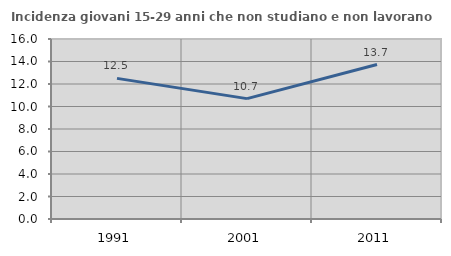
| Category | Incidenza giovani 15-29 anni che non studiano e non lavorano  |
|---|---|
| 1991.0 | 12.5 |
| 2001.0 | 10.7 |
| 2011.0 | 13.731 |